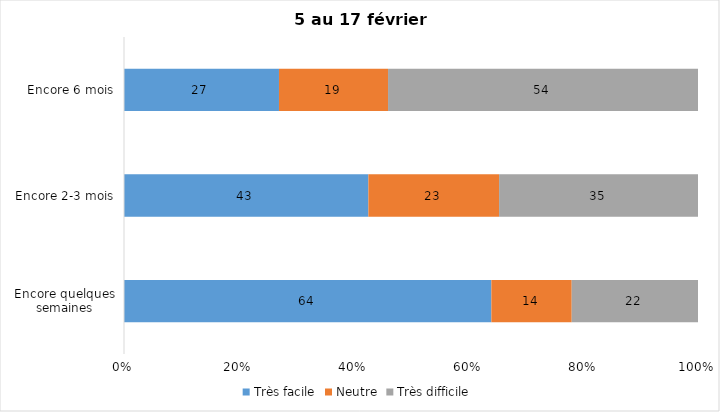
| Category | Très facile | Neutre | Très difficile |
|---|---|---|---|
| Encore quelques semaines | 64 | 14 | 22 |
| Encore 2-3 mois | 43 | 23 | 35 |
| Encore 6 mois | 27 | 19 | 54 |